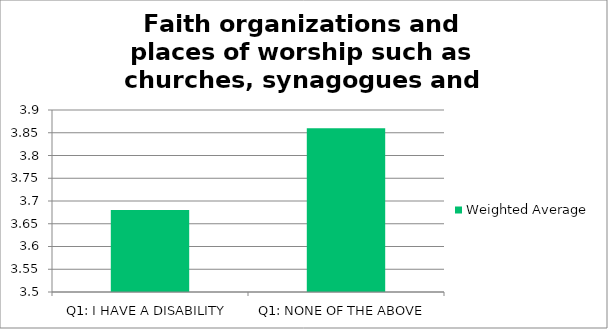
| Category | Weighted Average |
|---|---|
| Q1: I HAVE A DISABILITY | 3.68 |
| Q1: NONE OF THE ABOVE | 3.86 |